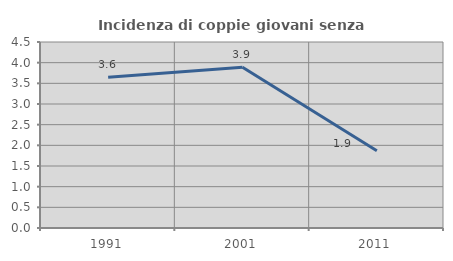
| Category | Incidenza di coppie giovani senza figli |
|---|---|
| 1991.0 | 3.646 |
| 2001.0 | 3.89 |
| 2011.0 | 1.867 |